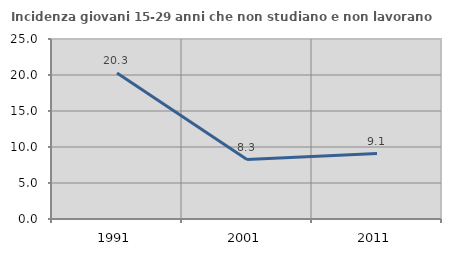
| Category | Incidenza giovani 15-29 anni che non studiano e non lavorano  |
|---|---|
| 1991.0 | 20.275 |
| 2001.0 | 8.257 |
| 2011.0 | 9.091 |